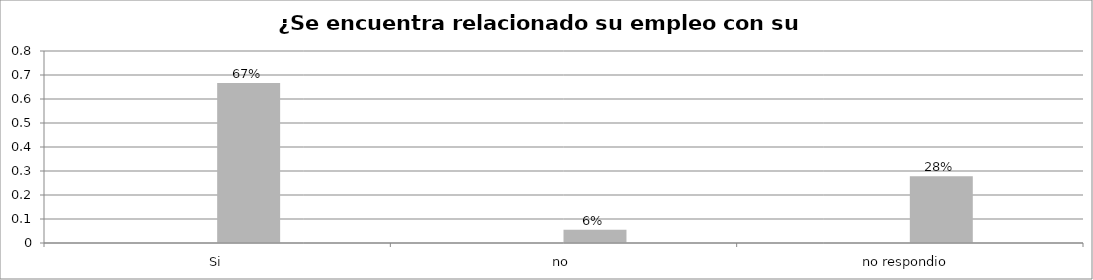
| Category | Series 0 | Series 1 | Series 2 | Series 3 |
|---|---|---|---|---|
| Si |  |  | 0.667 |  |
| no  |  |  | 0.056 |  |
| no respondio  |  |  | 0.278 |  |